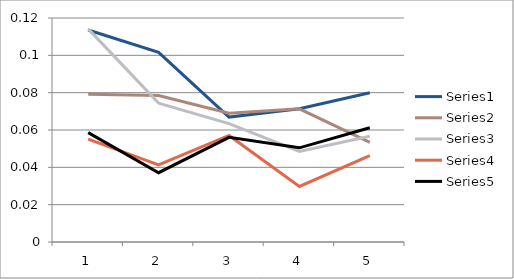
| Category | Series 0 | Series 1 | Series 2 | Series 3 | Series 4 |
|---|---|---|---|---|---|
| 0 | 0.114 | 0.079 | 0.114 | 0.055 | 0.059 |
| 1 | 0.102 | 0.078 | 0.074 | 0.041 | 0.037 |
| 2 | 0.067 | 0.069 | 0.063 | 0.057 | 0.056 |
| 3 | 0.071 | 0.071 | 0.049 | 0.03 | 0.05 |
| 4 | 0.08 | 0.053 | 0.057 | 0.046 | 0.061 |